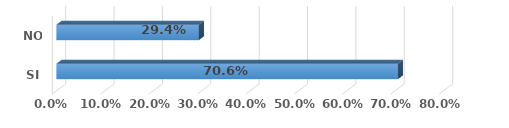
| Category | Series 0 |
|---|---|
| SI | 0.706 |
| NO | 0.294 |